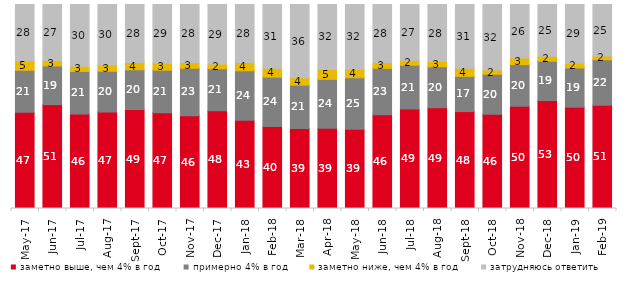
| Category | заметно выше, чем 4% в год | примерно 4% в год | заметно ниже, чем 4% в год | затрудняюсь ответить |
|---|---|---|---|---|
| 2017-05-01 | 47.2 | 20.55 | 4.55 | 27.7 |
| 2017-06-01 | 50.9 | 18.95 | 2.65 | 27.45 |
| 2017-07-01 | 46.35 | 20.8 | 2.5 | 30.3 |
| 2017-08-01 | 47.3 | 19.95 | 3.1 | 29.65 |
| 2017-09-01 | 48.5 | 19.5 | 3.55 | 28.45 |
| 2017-10-01 | 46.9 | 20.9 | 3.45 | 28.75 |
| 2017-11-01 | 45.5 | 23.25 | 2.85 | 28.4 |
| 2017-12-01 | 47.95 | 20.55 | 2.3 | 29.2 |
| 2018-01-01 | 43.3 | 24.2 | 4.05 | 28.45 |
| 2018-02-01 | 40.25 | 24.15 | 4.35 | 31.25 |
| 2018-03-01 | 39.2 | 21.25 | 3.7 | 35.85 |
| 2018-04-01 | 39.3 | 24 | 4.85 | 31.85 |
| 2018-05-01 | 38.8 | 25.3 | 4.15 | 31.75 |
| 2018-06-01 | 45.9 | 22.8 | 2.85 | 28.45 |
| 2018-07-01 | 48.8 | 21.4 | 2.45 | 27.35 |
| 2018-08-01 | 49.4 | 20.05 | 2.55 | 28 |
| 2018-09-01 | 47.5 | 17.25 | 4 | 31.2 |
| 2018-10-01 | 46.2 | 19.6 | 2.15 | 32.05 |
| 2018-11-01 | 50.15 | 20.409 | 3.244 | 26.198 |
| 2018-12-01 | 52.95 | 19.25 | 2.4 | 25.4 |
| 2019-01-01 | 49.65 | 19.25 | 2.3 | 28.8 |
| 2019-02-01 | 50.65 | 22.25 | 1.9 | 25.2 |